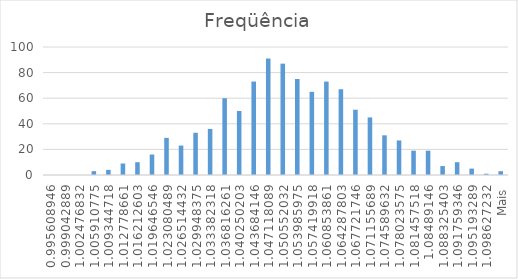
| Category | Freqüência |
|---|---|
| 0,995608946 | 0 |
| 0,999042889 | 0 |
| 1,002476832 | 0 |
| 1,005910775 | 3 |
| 1,009344718 | 4 |
| 1,012778661 | 9 |
| 1,016212603 | 10 |
| 1,019646546 | 16 |
| 1,023080489 | 29 |
| 1,026514432 | 23 |
| 1,029948375 | 33 |
| 1,033382318 | 36 |
| 1,036816261 | 60 |
| 1,040250203 | 50 |
| 1,043684146 | 73 |
| 1,047118089 | 91 |
| 1,050552032 | 87 |
| 1,053985975 | 75 |
| 1,057419918 | 65 |
| 1,060853861 | 73 |
| 1,064287803 | 67 |
| 1,067721746 | 51 |
| 1,071155689 | 45 |
| 1,074589632 | 31 |
| 1,078023575 | 27 |
| 1,081457518 | 19 |
| 1,08489146 | 19 |
| 1,088325403 | 7 |
| 1,091759346 | 10 |
| 1,095193289 | 5 |
| 1,098627232 | 1 |
| Mais | 3 |